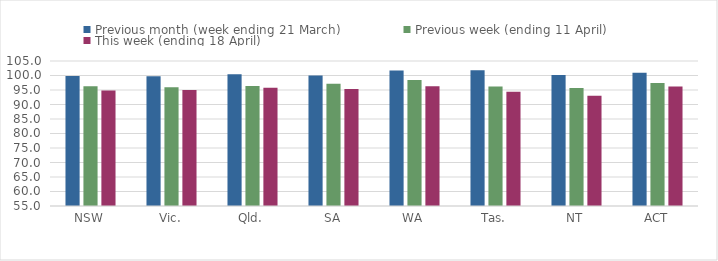
| Category | Previous month (week ending 21 March) | Previous week (ending 11 April) | This week (ending 18 April) |
|---|---|---|---|
| NSW | 99.817 | 96.277 | 94.83 |
| Vic. | 99.724 | 95.95 | 94.988 |
| Qld. | 100.443 | 96.349 | 95.807 |
| SA | 100.026 | 97.188 | 95.323 |
| WA | 101.745 | 98.474 | 96.324 |
| Tas. | 101.839 | 96.167 | 94.39 |
| NT | 100.196 | 95.726 | 92.991 |
| ACT | 100.935 | 97.409 | 96.173 |